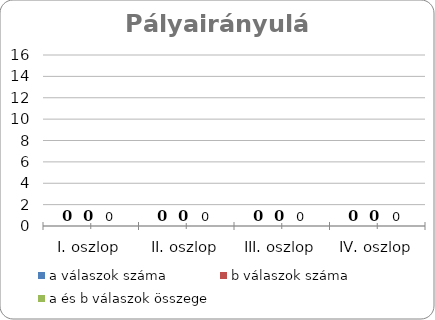
| Category | a válaszok száma | b válaszok száma | a és b válaszok összege |
|---|---|---|---|
| I. oszlop | 0 | 0 | 0 |
| II. oszlop | 0 | 0 | 0 |
| III. oszlop | 0 | 0 | 0 |
| IV. oszlop | 0 | 0 | 0 |